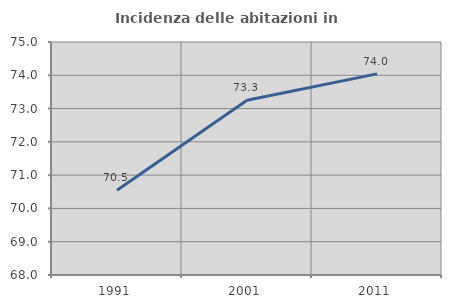
| Category | Incidenza delle abitazioni in proprietà  |
|---|---|
| 1991.0 | 70.545 |
| 2001.0 | 73.25 |
| 2011.0 | 74.043 |